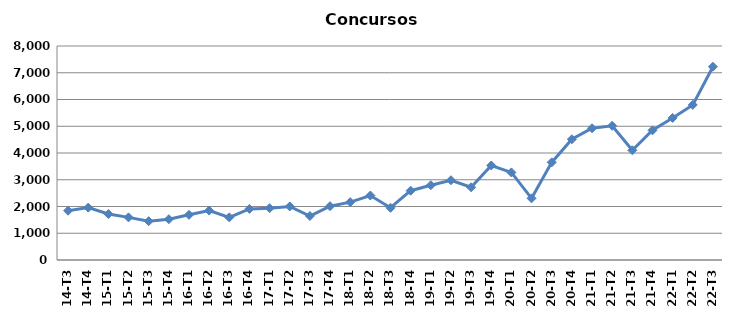
| Category | Concursos |
|---|---|
| 14-T3 | 1843 |
| 14-T4 | 1958 |
| 15-T1 | 1718 |
| 15-T2 | 1593 |
| 15-T3 | 1451 |
| 15-T4 | 1526 |
| 16-T1 | 1689 |
| 16-T2 | 1847 |
| 16-T3 | 1593 |
| 16-T4 | 1911 |
| 17-T1 | 1937 |
| 17-T2 | 2001 |
| 17-T3 | 1645 |
| 17-T4 | 2011 |
| 18-T1 | 2162 |
| 18-T2 | 2410 |
| 18-T3 | 1953 |
| 18-T4 | 2590 |
| 19-T1 | 2796 |
| 19-T2 | 2982 |
| 19-T3 | 2719 |
| 19-T4 | 3534 |
| 20-T1 | 3274 |
| 20-T2 | 2305 |
| 20-T3 | 3649 |
| 20-T4 | 4513 |
| 21-T1 | 4925 |
| 21-T2 | 5017 |
| 21-T3 | 4101 |
| 21-T4 | 4849 |
| 22-T1 | 5312 |
| 22-T2 | 5798 |
| 22-T3 | 7225 |